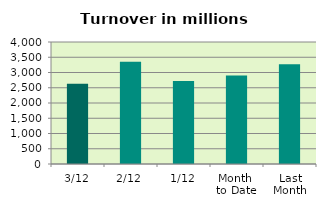
| Category | Series 0 |
|---|---|
| 3/12 | 2627.394 |
| 2/12 | 3348.831 |
| 1/12 | 2718.046 |
| Month 
to Date | 2898.09 |
| Last
Month | 3273.817 |